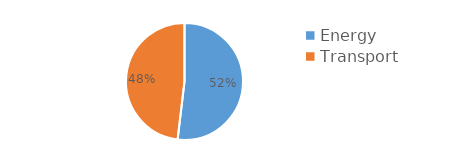
| Category | MTCO2e* |
|---|---|
| Energy | 6.9 |
| Transport | 6.4 |